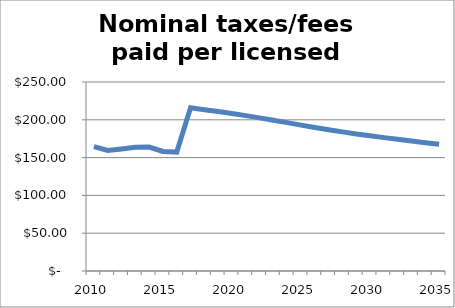
| Category | Series 0 |
|---|---|
| 2010.0 | 164.477 |
| 2011.0 | 159.456 |
| 2012.0 | 161.503 |
| 2013.0 | 163.682 |
| 2014.0 | 163.994 |
| 2015.0 | 158.176 |
| 2016.0 | 157.287 |
| 2017.0 | 215.831 |
| 2018.0 | 213.358 |
| 2019.0 | 210.886 |
| 2020.0 | 208.317 |
| 2021.0 | 205.528 |
| 2022.0 | 202.569 |
| 2023.0 | 199.499 |
| 2024.0 | 196.293 |
| 2025.0 | 192.995 |
| 2026.0 | 189.837 |
| 2027.0 | 186.847 |
| 2028.0 | 183.993 |
| 2029.0 | 181.298 |
| 2030.0 | 178.771 |
| 2031.0 | 176.4 |
| 2032.0 | 174.195 |
| 2033.0 | 171.92 |
| 2034.0 | 169.756 |
| 2035.0 | 167.702 |